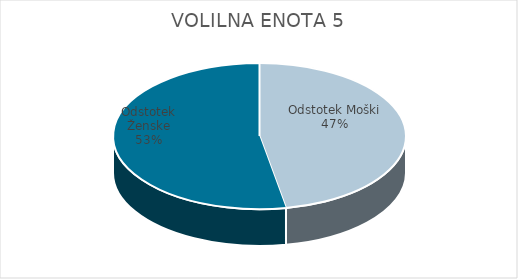
| Category | VOLILNA ENOTA 5 | #REF! | Slovenija skupaj |
|---|---|---|---|
| Odstotek Moški | 21.25 |  | 21.63 |
| Odstotek Ženske | 23.86 |  | 24.53 |